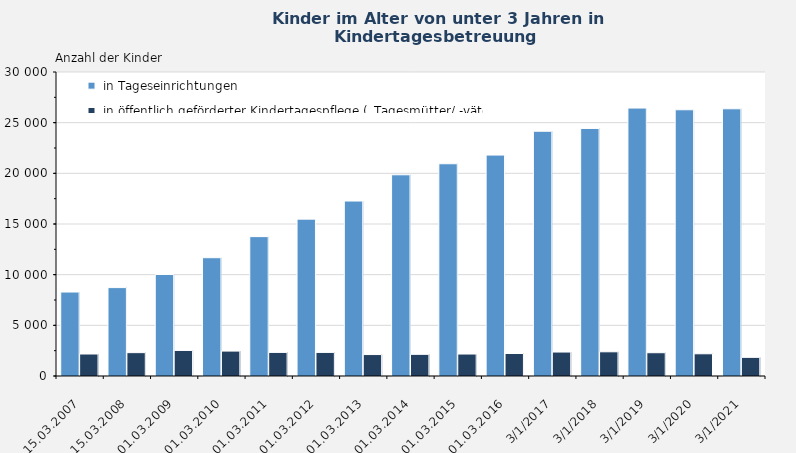
| Category |  in Tageseinrichtungen |  in öffentlich geförderter Kindertagespflege („Tagesmütter/ -väter“) |
|---|---|---|
| 15.03.2007 | 8286 | 2171 |
| 15.03.2008 | 8723 | 2304 |
| 01.03.2009 | 10017 | 2521 |
| 01.03.2010 | 11673 | 2460 |
| 01.03.2011 | 13753 | 2328 |
| 01.03.2012 | 15480 | 2327 |
| 01.03.2013 | 17266 | 2117 |
| 01.03.2014 | 19857 | 2138 |
| 01.03.2015 | 20945 | 2168 |
| 01.03.2016 | 21803 | 2219 |
| 01.03.2017 | 24153 | 2365 |
| 01.03.2018 | 24428 | 2387 |
| 01.03.2019 | 26442 | 2296 |
| 01.03.2020 | 26273 | 2192 |
| 01.03.2021 | 26369 | 1840 |